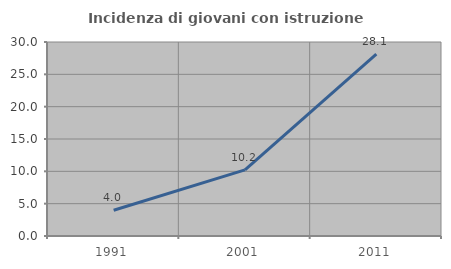
| Category | Incidenza di giovani con istruzione universitaria |
|---|---|
| 1991.0 | 3.974 |
| 2001.0 | 10.217 |
| 2011.0 | 28.114 |